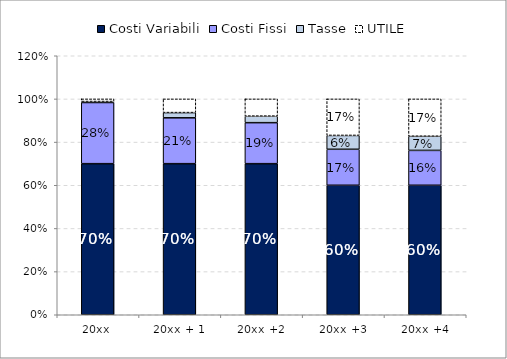
| Category | Costi Variabili | Costi Fissi | Tasse | UTILE |
|---|---|---|---|---|
| 20xx | 0.7 | 0.283 | 0.005 | 0.012 |
| 20xx + 1 | 0.7 | 0.213 | 0.024 | 0.063 |
| 20xx +2 | 0.7 | 0.19 | 0.03 | 0.08 |
| 20xx +3 | 0.6 | 0.167 | 0.064 | 0.169 |
| 20xx +4 | 0.6 | 0.162 | 0.066 | 0.173 |